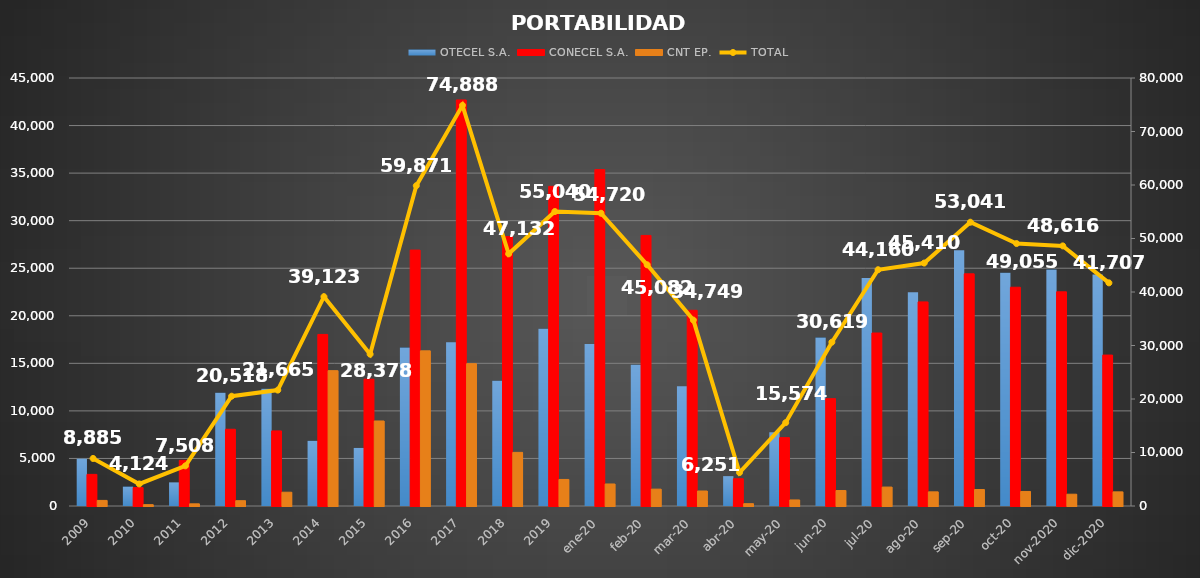
| Category | OTECEL S.A. | CONECEL S.A. | CNT EP. |
|---|---|---|---|
| 2009 | 4973 | 3324 | 588 |
| 2010 | 2045 | 1939 | 140 |
| 2011 | 2484 | 4796 | 228 |
| 2012 | 11894 | 8067 | 557 |
| 2013 | 12323 | 7893 | 1449 |
| 2014 | 6853 | 18039 | 14231 |
| 2015 | 6105 | 13334 | 8939 |
| 2016 | 16653 | 26907 | 16311 |
| 2017 | 17228 | 42694 | 14966 |
| 2018 | 13166 | 28329 | 5637 |
| 2019 | 18642 | 33608 | 2790 |
| ene-20 | 17036 | 35368 | 2316 |
| feb-20 | 14864 | 28446 | 1772 |
| mar-20 | 12593 | 20579 | 1577 |
| abr-20 | 3141 | 2866 | 244 |
| may-20 | 7752 | 7186 | 636 |
| jun-20 | 17706 | 11285 | 1628 |
| jul-20 | 23981 | 18188 | 1991 |
| ago-20 | 22463 | 21459 | 1488 |
| sep-20 | 26900 | 24409 | 1732 |
| oct-20 | 24527 | 23000 | 1528 |
| nov-2020 | 24859 | 22517 | 1240 |
| dic-2020 | 24352 | 15869 | 1486 |